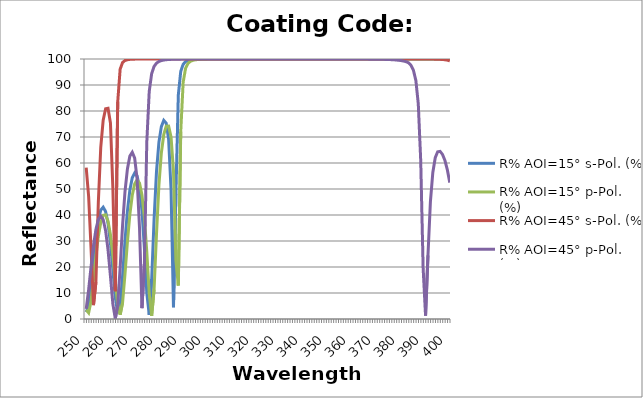
| Category | R% AOI=15° s-Pol. (%) | R% AOI=15° p-Pol. (%) | R% AOI=45° s-Pol. (%) | R% AOI=45° p-Pol. (%) |
|---|---|---|---|---|
| 250.0 | 2.681 | 3.51 | 58.186 | 3.874 |
| 251.0 | 5.044 | 2.368 | 47.124 | 11.267 |
| 252.0 | 12.816 | 6.876 | 27.035 | 20.106 |
| 253.0 | 22.627 | 15.134 | 5.338 | 28.228 |
| 254.0 | 31.513 | 24.148 | 14.161 | 34.432 |
| 255.0 | 38.055 | 31.779 | 44.92 | 38.261 |
| 256.0 | 41.886 | 37.099 | 66.042 | 39.57 |
| 257.0 | 43 | 39.873 | 76.493 | 38.229 |
| 258.0 | 41.368 | 40.071 | 80.876 | 33.997 |
| 259.0 | 36.825 | 37.625 | 81.066 | 26.628 |
| 260.0 | 29.211 | 32.401 | 75.398 | 16.441 |
| 261.0 | 18.955 | 24.425 | 50.21 | 5.737 |
| 262.0 | 8.316 | 14.537 | 10.654 | 0.156 |
| 263.0 | 2.24 | 5.428 | 83.535 | 5.399 |
| 264.0 | 5.375 | 1.64 | 96.096 | 19.796 |
| 265.0 | 16.535 | 6.247 | 98.653 | 35.983 |
| 266.0 | 30.015 | 17.218 | 99.426 | 48.986 |
| 267.0 | 41.486 | 29.662 | 99.72 | 57.721 |
| 268.0 | 49.57 | 40.161 | 99.85 | 62.638 |
| 269.0 | 54.349 | 47.595 | 99.914 | 64.134 |
| 270.0 | 56.143 | 51.981 | 99.948 | 61.841 |
| 271.0 | 55.001 | 53.533 | 99.967 | 53.794 |
| 272.0 | 50.488 | 52.245 | 99.978 | 34.864 |
| 273.0 | 41.617 | 47.714 | 99.985 | 4.173 |
| 274.0 | 27.369 | 39.12 | 99.99 | 21.136 |
| 275.0 | 9.947 | 25.769 | 99.993 | 68.136 |
| 276.0 | 1.634 | 9.778 | 99.995 | 87.528 |
| 277.0 | 15.01 | 1.195 | 99.996 | 94.377 |
| 278.0 | 38.372 | 11.328 | 99.997 | 97.135 |
| 279.0 | 56.784 | 32.745 | 99.998 | 98.399 |
| 280.0 | 67.991 | 51.555 | 99.998 | 99.041 |
| 281.0 | 74.009 | 63.855 | 99.999 | 99.394 |
| 282.0 | 76.38 | 70.895 | 99.999 | 99.599 |
| 283.0 | 75.361 | 74.166 | 99.999 | 99.725 |
| 284.0 | 69.113 | 74.197 | 99.999 | 99.806 |
| 285.0 | 49.724 | 70.03 | 99.999 | 99.859 |
| 286.0 | 4.495 | 57.175 | 100 | 99.895 |
| 287.0 | 48.096 | 22.58 | 100 | 99.92 |
| 288.0 | 86.178 | 12.889 | 100 | 99.938 |
| 289.0 | 95.243 | 72.051 | 100 | 99.952 |
| 290.0 | 97.966 | 91.091 | 100 | 99.961 |
| 291.0 | 98.997 | 96.423 | 100 | 99.969 |
| 292.0 | 99.455 | 98.309 | 100 | 99.974 |
| 293.0 | 99.682 | 99.106 | 100 | 99.979 |
| 294.0 | 99.803 | 99.488 | 100 | 99.982 |
| 295.0 | 99.873 | 99.688 | 100 | 99.985 |
| 296.0 | 99.915 | 99.801 | 100 | 99.987 |
| 297.0 | 99.941 | 99.867 | 100 | 99.989 |
| 298.0 | 99.958 | 99.909 | 100 | 99.99 |
| 299.0 | 99.97 | 99.936 | 100 | 99.991 |
| 300.0 | 99.977 | 99.953 | 100 | 99.992 |
| 301.0 | 99.983 | 99.965 | 100 | 99.993 |
| 302.0 | 99.987 | 99.974 | 100 | 99.994 |
| 303.0 | 99.99 | 99.98 | 100 | 99.994 |
| 304.0 | 99.992 | 99.984 | 100 | 99.995 |
| 305.0 | 99.994 | 99.988 | 100 | 99.995 |
| 306.0 | 99.995 | 99.99 | 100 | 99.996 |
| 307.0 | 99.996 | 99.992 | 100 | 99.996 |
| 308.0 | 99.996 | 99.993 | 100 | 99.996 |
| 309.0 | 99.997 | 99.994 | 100 | 99.996 |
| 310.0 | 99.997 | 99.995 | 100 | 99.997 |
| 311.0 | 99.998 | 99.996 | 100 | 99.997 |
| 312.0 | 99.998 | 99.997 | 100 | 99.997 |
| 313.0 | 99.998 | 99.997 | 100 | 99.997 |
| 314.0 | 99.999 | 99.998 | 100 | 99.997 |
| 315.0 | 99.999 | 99.998 | 100 | 99.997 |
| 316.0 | 99.999 | 99.998 | 100 | 99.998 |
| 317.0 | 99.999 | 99.998 | 100 | 99.998 |
| 318.0 | 99.999 | 99.998 | 100 | 99.998 |
| 319.0 | 99.999 | 99.999 | 100 | 99.998 |
| 320.0 | 99.999 | 99.999 | 100 | 99.998 |
| 321.0 | 99.999 | 99.999 | 100 | 99.998 |
| 322.0 | 99.999 | 99.999 | 100 | 99.998 |
| 323.0 | 100 | 99.999 | 100 | 99.998 |
| 324.0 | 100 | 99.999 | 100 | 99.998 |
| 325.0 | 100 | 99.999 | 100 | 99.998 |
| 326.0 | 100 | 99.999 | 100 | 99.998 |
| 327.0 | 100 | 99.999 | 100 | 99.998 |
| 328.0 | 100 | 99.999 | 100 | 99.998 |
| 329.0 | 100 | 99.999 | 100 | 99.998 |
| 330.0 | 100 | 99.999 | 100 | 99.998 |
| 331.0 | 100 | 100 | 100 | 99.997 |
| 332.0 | 100 | 100 | 100 | 99.997 |
| 333.0 | 100 | 100 | 100 | 99.997 |
| 334.0 | 100 | 100 | 100 | 99.997 |
| 335.0 | 100 | 100 | 100 | 99.997 |
| 336.0 | 100 | 100 | 100 | 99.997 |
| 337.0 | 100 | 100 | 100 | 99.997 |
| 338.0 | 100 | 100 | 100 | 99.997 |
| 339.0 | 100 | 100 | 100 | 99.996 |
| 340.0 | 100 | 100 | 100 | 99.996 |
| 341.0 | 100 | 100 | 100 | 99.996 |
| 342.0 | 100 | 100 | 100 | 99.996 |
| 343.0 | 100 | 100 | 100 | 99.996 |
| 344.0 | 100 | 100 | 100 | 99.995 |
| 345.0 | 100 | 100 | 100 | 99.995 |
| 346.0 | 100 | 100 | 100 | 99.995 |
| 347.0 | 100 | 100 | 100 | 99.994 |
| 348.0 | 100 | 100 | 100 | 99.994 |
| 349.0 | 100 | 100 | 100 | 99.993 |
| 350.0 | 100 | 100 | 100 | 99.992 |
| 351.0 | 100 | 100 | 100 | 99.992 |
| 352.0 | 100 | 100 | 100 | 99.991 |
| 353.0 | 100 | 100 | 100 | 99.99 |
| 354.0 | 100 | 100 | 100 | 99.989 |
| 355.0 | 100 | 100 | 100 | 99.988 |
| 356.0 | 100 | 100 | 100 | 99.987 |
| 357.0 | 100 | 100 | 100 | 99.985 |
| 358.0 | 100 | 100 | 100 | 99.984 |
| 359.0 | 100 | 100 | 100 | 99.982 |
| 360.0 | 100 | 100 | 100 | 99.979 |
| 361.0 | 100 | 100 | 100 | 99.976 |
| 362.0 | 100 | 100 | 100 | 99.973 |
| 363.0 | 100 | 100 | 100 | 99.97 |
| 364.0 | 100 | 100 | 100 | 99.965 |
| 365.0 | 100 | 99.999 | 100 | 99.96 |
| 366.0 | 100 | 99.999 | 100 | 99.954 |
| 367.0 | 100 | 99.999 | 100 | 99.947 |
| 368.0 | 100 | 99.999 | 100 | 99.938 |
| 369.0 | 100 | 99.999 | 100 | 99.927 |
| 370.0 | 100 | 99.999 | 100 | 99.915 |
| 371.0 | 100 | 99.999 | 100 | 99.899 |
| 372.0 | 100 | 99.999 | 100 | 99.88 |
| 373.0 | 100 | 99.999 | 99.999 | 99.856 |
| 374.0 | 99.999 | 99.999 | 99.999 | 99.827 |
| 375.0 | 99.999 | 99.999 | 99.999 | 99.79 |
| 376.0 | 99.999 | 99.999 | 99.999 | 99.743 |
| 377.0 | 99.999 | 99.999 | 99.999 | 99.684 |
| 378.0 | 99.999 | 99.999 | 99.999 | 99.607 |
| 379.0 | 99.999 | 99.999 | 99.999 | 99.506 |
| 380.0 | 99.999 | 99.999 | 99.999 | 99.374 |
| 381.0 | 99.999 | 99.998 | 99.999 | 99.196 |
| 382.0 | 99.999 | 99.998 | 99.998 | 98.954 |
| 383.0 | 99.999 | 99.998 | 99.998 | 98.53 |
| 384.0 | 99.999 | 99.998 | 99.998 | 97.547 |
| 385.0 | 99.998 | 99.997 | 99.997 | 95.663 |
| 386.0 | 99.998 | 99.997 | 99.996 | 91.741 |
| 387.0 | 99.998 | 99.996 | 99.994 | 82.781 |
| 388.0 | 99.998 | 99.996 | 99.992 | 61.103 |
| 389.0 | 99.997 | 99.994 | 99.99 | 19.646 |
| 390.0 | 99.996 | 99.993 | 99.986 | 1.299 |
| 391.0 | 99.995 | 99.992 | 99.98 | 24.454 |
| 392.0 | 99.994 | 99.99 | 99.972 | 45.07 |
| 393.0 | 99.993 | 99.987 | 99.96 | 56.389 |
| 394.0 | 99.991 | 99.984 | 99.941 | 62.023 |
| 395.0 | 99.989 | 99.979 | 99.912 | 64.319 |
| 396.0 | 99.986 | 99.974 | 99.87 | 64.477 |
| 397.0 | 99.983 | 99.968 | 99.809 | 63.306 |
| 398.0 | 99.979 | 99.959 | 99.713 | 60.933 |
| 399.0 | 99.974 | 99.949 | 99.555 | 57.338 |
| 400.0 | 99.968 | 99.935 | 99.283 | 52.444 |